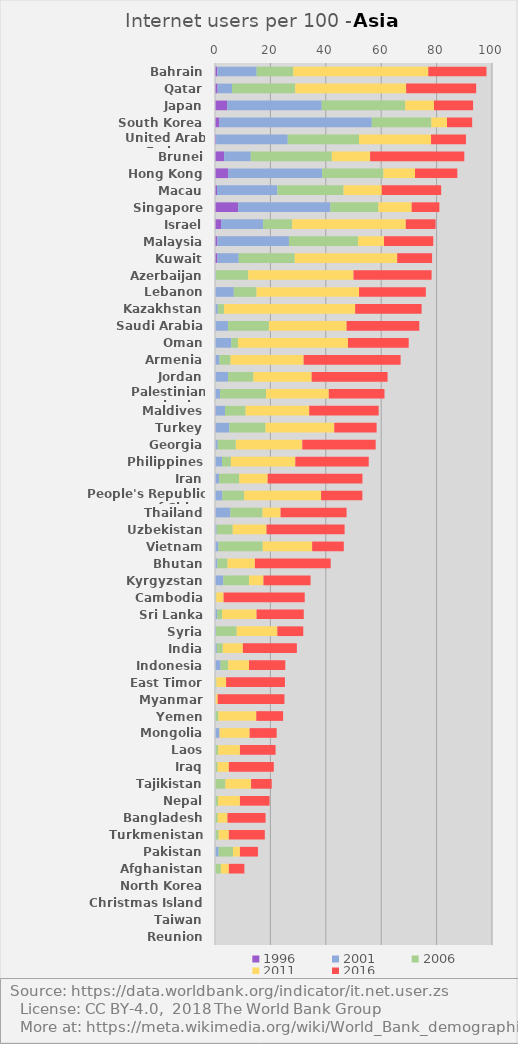
| Category | 1996 | 2001 | 2006 | 2011 | 2016 |
|---|---|---|---|---|---|
| Bahrain | 0.84 | 14.2 | 13.2 | 48.76 | 21 |
| Qatar | 0.93 | 5.24 | 22.8 | 40.03 | 25.29 |
| Japan | 4.37 | 34.16 | 30.16 | 10.36 | 14.13 |
| South Korea | 1.62 | 54.98 | 21.5 | 5.66 | 9.08 |
| United Arab Emirates | 0.38 | 25.89 | 25.73 | 26 | 12.6 |
| Brunei | 3.3 | 9.62 | 29.27 | 13.81 | 34 |
| Hong Kong | 4.75 | 33.92 | 22.13 | 11.4 | 15.28 |
| Macau | 0.73 | 21.79 | 23.88 | 13.8 | 21.44 |
| Singapore | 8.35 | 33.32 | 17.33 | 12 | 10 |
| Israel | 2.17 | 15.21 | 10.5 | 40.99 | 10.78 |
| Malaysia | 0.85 | 25.85 | 24.94 | 9.36 | 17.79 |
| Kuwait | 0.86 | 7.69 | 20.24 | 36.98 | 12.6 |
| Azerbaijan | 0.01 | 0.3 | 11.68 | 38.01 | 28.2 |
| Lebanon | 0.14 | 6.64 | 8.22 | 37 | 24.11 |
| Kazakhstan | 0.03 | 0.98 | 2.26 | 47.33 | 23.99 |
| Saudi Arabia | 0.03 | 4.65 | 14.78 | 28.04 | 26.25 |
| Oman | 0 | 5.89 | 2.41 | 39.7 | 21.93 |
| Armenia | 0.09 | 1.54 | 4 | 26.37 | 35 |
| Jordan | 0.04 | 4.67 | 9.16 | 21.03 | 27.4 |
| Palestinian territories | 0 | 1.84 | 16.57 | 22.67 | 20.1 |
| Maldives | 0.23 | 3.39 | 7.42 | 22.96 | 25.09 |
| Turkey | 0.19 | 5 | 13.05 | 24.83 | 15.28 |
| Georgia | 0.04 | 0.95 | 6.54 | 23.99 | 26.49 |
| Philippines | 0.06 | 2.46 | 3.22 | 23.26 | 26.5 |
| Iran | 0.02 | 1.46 | 7.28 | 10.24 | 34.23 |
| People's Republic of China | 0.01 | 2.63 | 7.88 | 27.78 | 14.9 |
| Thailand | 0.12 | 5.44 | 11.6 | 6.51 | 23.83 |
| Uzbekistan | 0 | 0.6 | 5.79 | 12.21 | 28.19 |
| Vietnam | 0 | 1.27 | 15.98 | 17.82 | 11.43 |
| Bhutan | 0 | 0.86 | 3.66 | 9.88 | 27.37 |
| Kyrgyzstan | 0 | 3 | 9.31 | 5.19 | 17 |
| Cambodia | 0 | 0.08 | 0.39 | 2.63 | 29.3 |
| Sri Lanka | 0.05 | 0.74 | 1.75 | 12.46 | 17.05 |
| Syria | 0 | 0.35 | 7.48 | 14.67 | 9.37 |
| India | 0.05 | 0.61 | 2.15 | 7.26 | 19.48 |
| Indonesia | 0.06 | 1.96 | 2.74 | 7.52 | 13.09 |
| East Timor | 0 | 0 | 0.5 | 3.5 | 21.25 |
| Myanmar | 0 | 0 | 0.18 | 0.8 | 24.09 |
| Yemen | 0 | 0.09 | 1.16 | 13.65 | 9.68 |
| Mongolia | 0.02 | 1.63 | 0 | 10.85 | 9.77 |
| Laos | 0 | 0.18 | 0.99 | 7.83 | 12.87 |
| Iraq | 0 | 0.1 | 0.85 | 4.05 | 16.23 |
| Tajikistan | 0 | 0.05 | 3.72 | 9.26 | 7.44 |
| Nepal | 0 | 0.24 | 0.9 | 7.86 | 10.69 |
| Bangladesh | 0 | 0.13 | 0.87 | 3.5 | 13.75 |
| Turkmenistan | 0 | 0.18 | 1.14 | 3.68 | 12.99 |
| Pakistan | 0 | 1.32 | 5.18 | 2.5 | 6.51 |
| Afghanistan | 0 | 0 | 2.11 | 2.89 | 5.6 |
| North Korea | 0 | 0 | 0 | 0 | 0 |
| Christmas Island | 0 | 0 | 0 | 0 | 0 |
| Taiwan | 0 | 0 | 0 | 0 | 0 |
| Reunion | 0 | 0 | 0 | 0 | 0 |